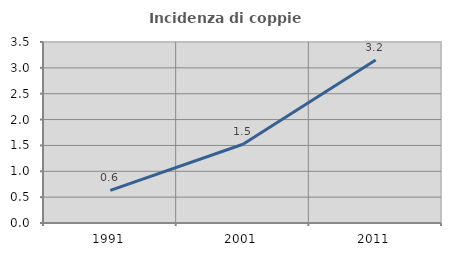
| Category | Incidenza di coppie miste |
|---|---|
| 1991.0 | 0.63 |
| 2001.0 | 1.522 |
| 2011.0 | 3.152 |